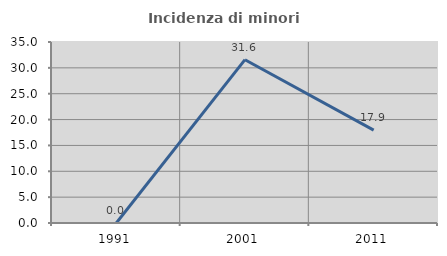
| Category | Incidenza di minori stranieri |
|---|---|
| 1991.0 | 0 |
| 2001.0 | 31.579 |
| 2011.0 | 17.949 |